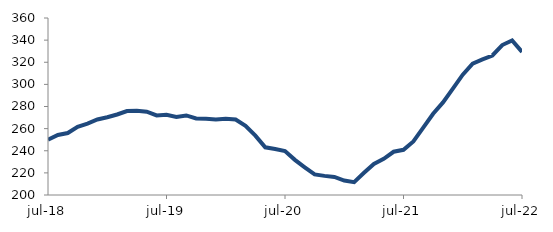
| Category | Series 0 |
|---|---|
| 2018-07-01 | 249.922 |
| 2018-08-01 | 254.259 |
| 2018-09-01 | 256.028 |
| 2018-10-01 | 261.709 |
| 2018-11-01 | 264.559 |
| 2018-12-01 | 268.288 |
| 2019-01-01 | 270.264 |
| 2019-02-01 | 272.765 |
| 2019-03-01 | 275.922 |
| 2019-04-01 | 276.17 |
| 2019-05-01 | 275.323 |
| 2019-06-01 | 271.933 |
| 2019-07-01 | 272.528 |
| 2019-08-01 | 270.617 |
| 2019-09-01 | 271.909 |
| 2019-10-01 | 269.246 |
| 2019-11-01 | 268.873 |
| 2019-12-01 | 268.319 |
| 2020-01-01 | 268.914 |
| 2020-02-01 | 268.233 |
| 2020-03-01 | 262.58 |
| 2020-04-01 | 253.663 |
| 2020-05-01 | 243.088 |
| 2020-06-01 | 241.541 |
| 2020-07-01 | 239.786 |
| 2020-08-01 | 231.766 |
| 2020-09-01 | 225.047 |
| 2020-10-01 | 218.571 |
| 2020-11-01 | 217.286 |
| 2020-12-01 | 216.368 |
| 2021-01-01 | 213.087 |
| 2021-02-01 | 211.643 |
| 2021-03-01 | 220.04 |
| 2021-04-01 | 228.12 |
| 2021-05-01 | 232.717 |
| 2021-06-01 | 239.097 |
| 2021-07-01 | 240.846 |
| 2021-08-01 | 248.449 |
| 2021-09-01 | 260.934 |
| 2021-10-01 | 273.441 |
| 2021-11-01 | 283.683 |
| 2021-12-01 | 296.134 |
| 2022-01-01 | 308.804 |
| 2022-02-01 | 318.726 |
| 2022-03-01 | 322.592 |
| 2022-04-01 | 326.114 |
| 2022-05-01 | 335.557 |
| 2022-06-01 | 339.684 |
| 2022-07-01 | 329.357 |